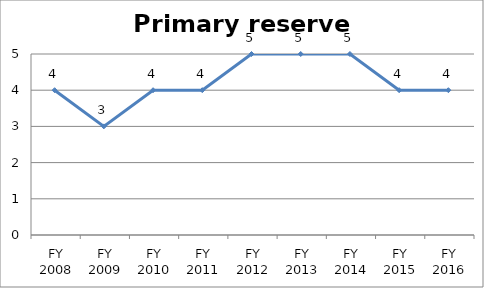
| Category | Primary reserve score |
|---|---|
| FY 2016 | 4 |
| FY 2015 | 4 |
| FY 2014 | 5 |
| FY 2013 | 5 |
| FY 2012 | 5 |
| FY 2011 | 4 |
| FY 2010 | 4 |
| FY 2009 | 3 |
| FY 2008 | 4 |